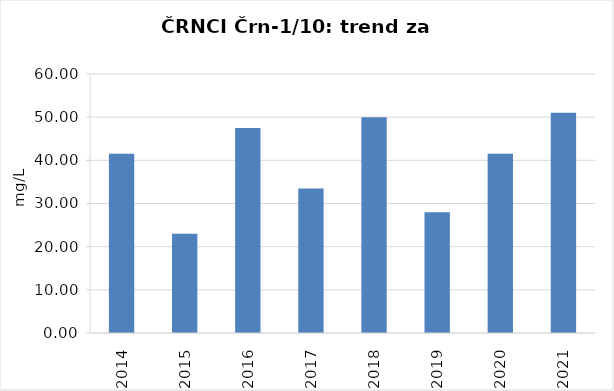
| Category | Vsota |
|---|---|
| 2014 | 41.5 |
| 2015 | 23 |
| 2016 | 47.5 |
| 2017 | 33.5 |
| 2018 | 50 |
| 2019 | 28 |
| 2020 | 41.5 |
| 2021 | 51 |